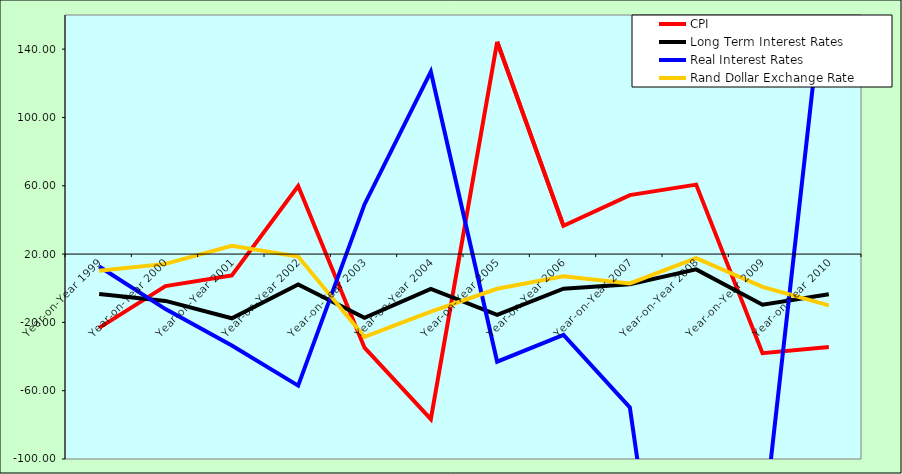
| Category | CPI | Long Term Interest Rates | Real Interest Rates | Rand Dollar Exchange Rate |
|---|---|---|---|---|
| Year-on-Year 1999 | -23.236 | -3.346 | 12.704 | 10.213 |
| Year-on-Year 2000 | 1.268 | -7.442 | -12.229 | 14.266 |
| Year-on-Year 2001 | 7.512 | -17.605 | -33.533 | 24.891 |
| Year-on-Year 2002 | 59.825 | 2.141 | -57.029 | 18.584 |
| Year-on-Year 2003 | -34.791 | -17.373 | 49.079 | -28.542 |
| Year-on-Year 2004 | -76.676 | -0.441 | 126.78 | -13.717 |
| Year-on-Year 2005 | 144.311 | -15.553 | -42.991 | -0.325 |
| Year-on-Year 2006 | 36.52 | -0.27 | -27.33 | 6.978 |
| Year-on-Year 2007 | 54.529 | 2.364 | -69.717 | 2.831 |
| Year-on-Year 2008 | 60.678 | 11.02 | -339.12 | 17.637 |
| Year-on-Year 2009 | -38.033 | -9.642 | -144.159 | 0.82 |
| Year-on-Year 2010 | -34.422 | -3.53 | 201.862 | -10.015 |